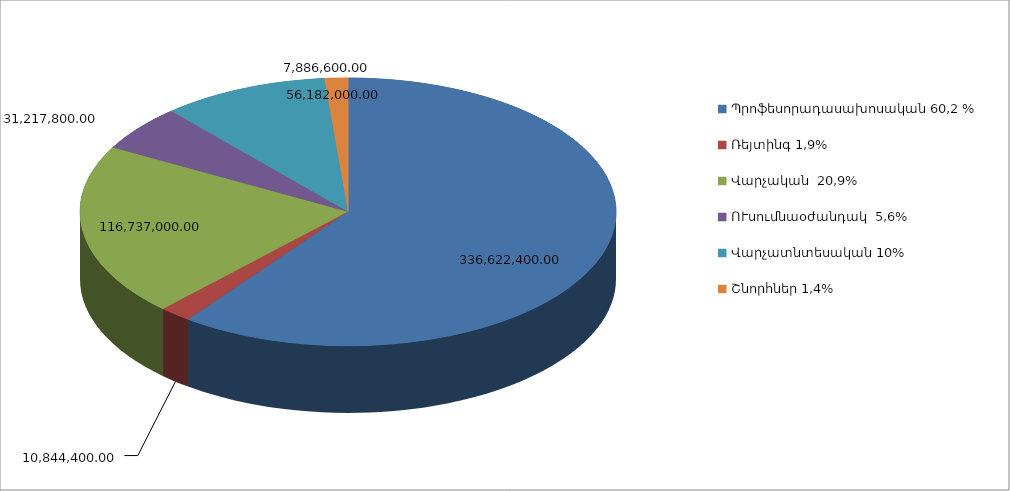
| Category | Series 0 |
|---|---|
| Պրոֆեսորադասախոսական 60,2 % | 336622400 |
| Ռեյտինգ 1,9% | 10844400 |
| Վարչական  20,9% | 116737000 |
| ՈՒսումնաօժանդակ  5,6% | 31217800 |
| Վարչատնտեսական 10% | 56182000 |
| Շնորհներ 1,4% | 7886600 |